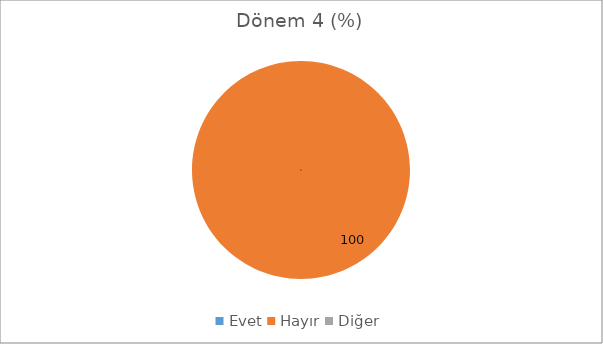
| Category | Dönem 4 (%) | Dönem 1 (%) |
|---|---|---|
| Evet | 0 | 6.14 |
| Hayır | 100 | 83.333 |
| Diğer | 0 | 10.526 |